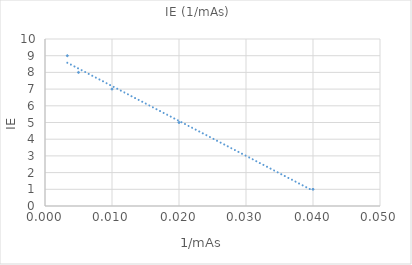
| Category | Series 0 |
|---|---|
| 0.04 | 1 |
| 0.02 | 5 |
| 0.01 | 7 |
| 0.005 | 8 |
| 0.0033333333333333335 | 9 |